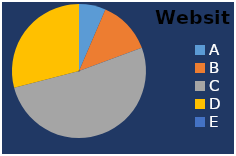
| Category | Website |
|---|---|
| A | 10 |
| B | 20 |
| C | 80 |
| D | 45 |
| E | 0 |